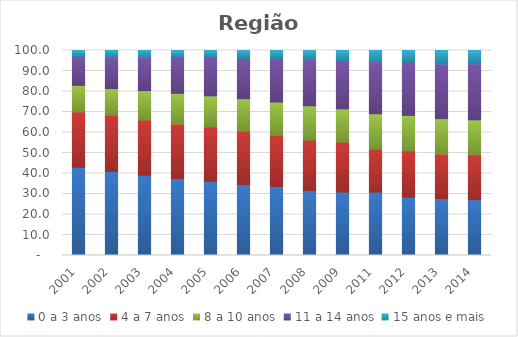
| Category | 0 a 3 anos | 4 a 7 anos | 8 a 10 anos | 11 a 14 anos | 15 anos e mais |
|---|---|---|---|---|---|
| 2001.0 | 43.06 | 27.08 | 12.85 | 14.08 | 2.92 |
| 2002.0 | 41.01 | 27.33 | 13.1 | 15.5 | 3.07 |
| 2003.0 | 39.14 | 27.08 | 14.23 | 16.42 | 3.14 |
| 2004.0 | 37.56 | 26.63 | 14.91 | 17.52 | 3.38 |
| 2005.0 | 36.24 | 26.59 | 15.02 | 18.78 | 3.38 |
| 2006.0 | 34.5 | 26.34 | 15.63 | 19.73 | 3.8 |
| 2007.0 | 33.64 | 24.95 | 16.27 | 21.16 | 4 |
| 2008.0 | 31.75 | 24.57 | 16.66 | 22.55 | 4.48 |
| 2009.0 | 30.95 | 24.41 | 16.14 | 23.68 | 4.82 |
| 2011.0 | 30.92 | 20.94 | 17.25 | 25.37 | 5.52 |
| 2012.0 | 28.47 | 22.69 | 17.18 | 25.99 | 5.67 |
| 2013.0 | 27.76 | 21.79 | 17.21 | 26.77 | 6.48 |
| 2014.0 | 27.24 | 21.77 | 17.14 | 27.43 | 6.43 |